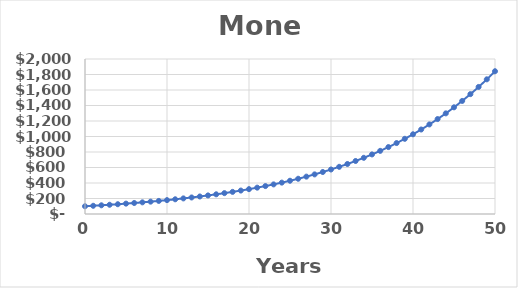
| Category | Money |
|---|---|
| 0.0 | 100 |
| 1.0 | 106 |
| 2.0 | 112.36 |
| 3.0 | 119.102 |
| 4.0 | 126.248 |
| 5.0 | 133.823 |
| 6.0 | 141.852 |
| 7.0 | 150.363 |
| 8.0 | 159.385 |
| 9.0 | 168.948 |
| 10.0 | 179.085 |
| 11.0 | 189.83 |
| 12.0 | 201.22 |
| 13.0 | 213.293 |
| 14.0 | 226.09 |
| 15.0 | 239.656 |
| 16.0 | 254.035 |
| 17.0 | 269.277 |
| 18.0 | 285.434 |
| 19.0 | 302.56 |
| 20.0 | 320.714 |
| 21.0 | 339.956 |
| 22.0 | 360.354 |
| 23.0 | 381.975 |
| 24.0 | 404.893 |
| 25.0 | 429.187 |
| 26.0 | 454.938 |
| 27.0 | 482.235 |
| 28.0 | 511.169 |
| 29.0 | 541.839 |
| 30.0 | 574.349 |
| 31.0 | 608.81 |
| 32.0 | 645.339 |
| 33.0 | 684.059 |
| 34.0 | 725.103 |
| 35.0 | 768.609 |
| 36.0 | 814.725 |
| 37.0 | 863.609 |
| 38.0 | 915.425 |
| 39.0 | 970.351 |
| 40.0 | 1028.572 |
| 41.0 | 1090.286 |
| 42.0 | 1155.703 |
| 43.0 | 1225.045 |
| 44.0 | 1298.548 |
| 45.0 | 1376.461 |
| 46.0 | 1459.049 |
| 47.0 | 1546.592 |
| 48.0 | 1639.387 |
| 49.0 | 1737.75 |
| 50.0 | 1842.015 |